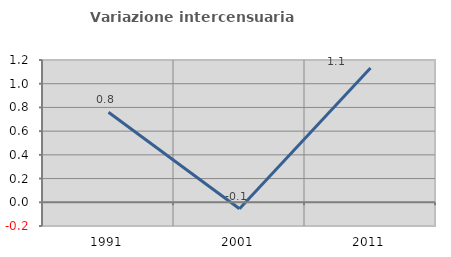
| Category | Variazione intercensuaria annua |
|---|---|
| 1991.0 | 0.76 |
| 2001.0 | -0.054 |
| 2011.0 | 1.132 |